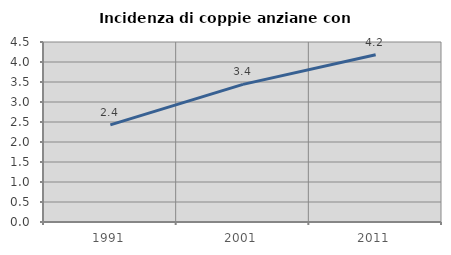
| Category | Incidenza di coppie anziane con figli |
|---|---|
| 1991.0 | 2.428 |
| 2001.0 | 3.44 |
| 2011.0 | 4.18 |